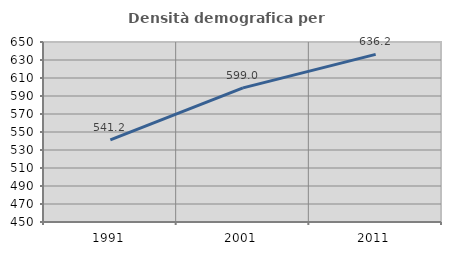
| Category | Densità demografica |
|---|---|
| 1991.0 | 541.229 |
| 2001.0 | 599.026 |
| 2011.0 | 636.206 |